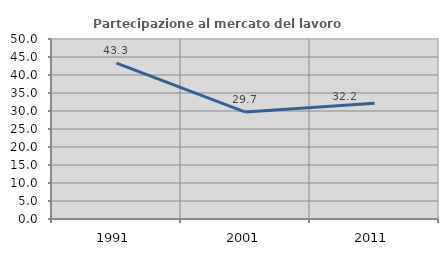
| Category | Partecipazione al mercato del lavoro  femminile |
|---|---|
| 1991.0 | 43.272 |
| 2001.0 | 29.691 |
| 2011.0 | 32.183 |